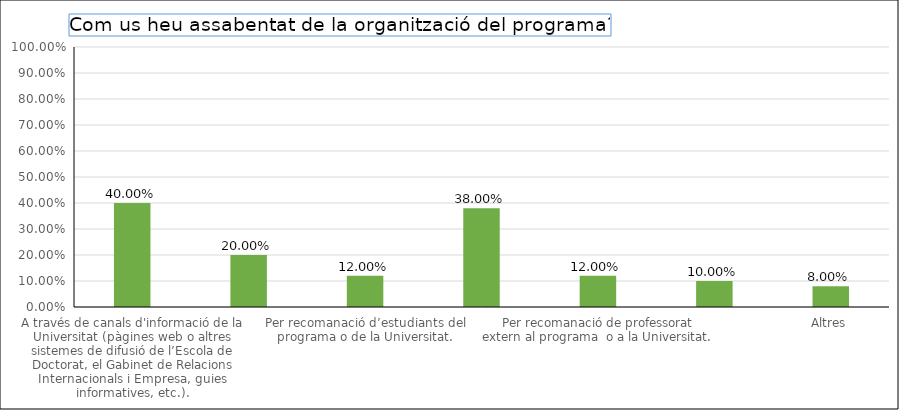
| Category | Series 0 |
|---|---|
| A través de canals d'informació de la Universitat (pàgines web o altres sistemes de difusió de l’Escola de Doctorat, el Gabinet de Relacions Internacionals i Empresa, guies informatives, etc.). | 0.4 |
| A través del departament o de l'institut (pàgines web pròpies i altres sistemes de difusió). | 0.2 |
| Per recomanació d’estudiants del programa o de la Universitat. | 0.12 |
| Per recomanació de professorat del programa o de la Universitat. | 0.38 |
| Per recomanació de professorat extern al programa  o a la Universitat. | 0.12 |
| Webs especialitzats. | 0.1 |
| Altres | 0.08 |